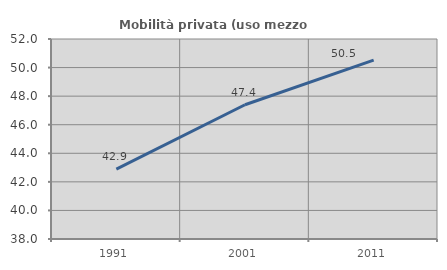
| Category | Mobilità privata (uso mezzo privato) |
|---|---|
| 1991.0 | 42.893 |
| 2001.0 | 47.4 |
| 2011.0 | 50.522 |